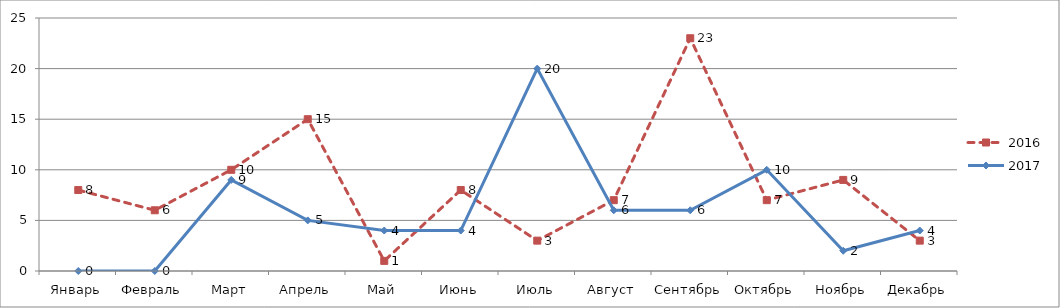
| Category | 2016 | 2017 |
|---|---|---|
| Январь | 8 | 0 |
| Февраль | 6 | 0 |
| Март | 10 | 9 |
| Апрель | 15 | 5 |
| Май | 1 | 4 |
| Июнь | 8 | 4 |
| Июль | 3 | 20 |
| Август | 7 | 6 |
| Сентябрь | 23 | 6 |
| Октябрь | 7 | 10 |
| Ноябрь | 9 | 2 |
| Декабрь | 3 | 4 |